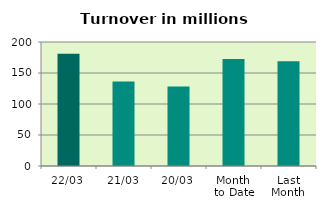
| Category | Series 0 |
|---|---|
| 22/03 | 180.985 |
| 21/03 | 136.354 |
| 20/03 | 128.071 |
| Month 
to Date | 172.527 |
| Last
Month | 168.971 |